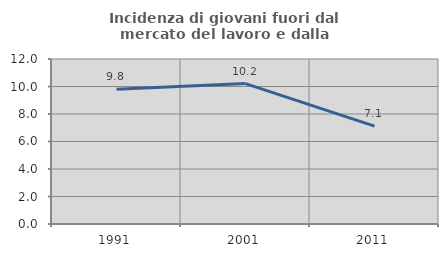
| Category | Incidenza di giovani fuori dal mercato del lavoro e dalla formazione  |
|---|---|
| 1991.0 | 9.806 |
| 2001.0 | 10.21 |
| 2011.0 | 7.12 |